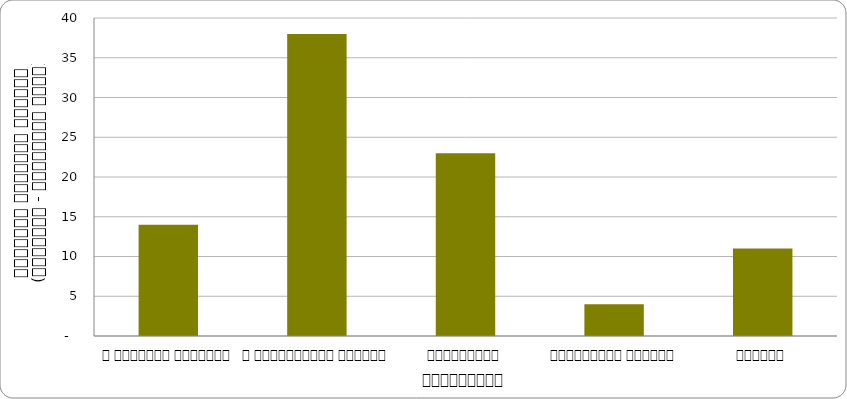
| Category | स्वास्थ्य  |
|---|---|
| द हिमालयन टाइम्स् | 14 |
| द काठमाण्डौं पोस्ट् | 38 |
| कान्तिपुर | 23 |
| अन्नपूर्ण पोस्ट् | 4 |
| नागरिक | 11 |